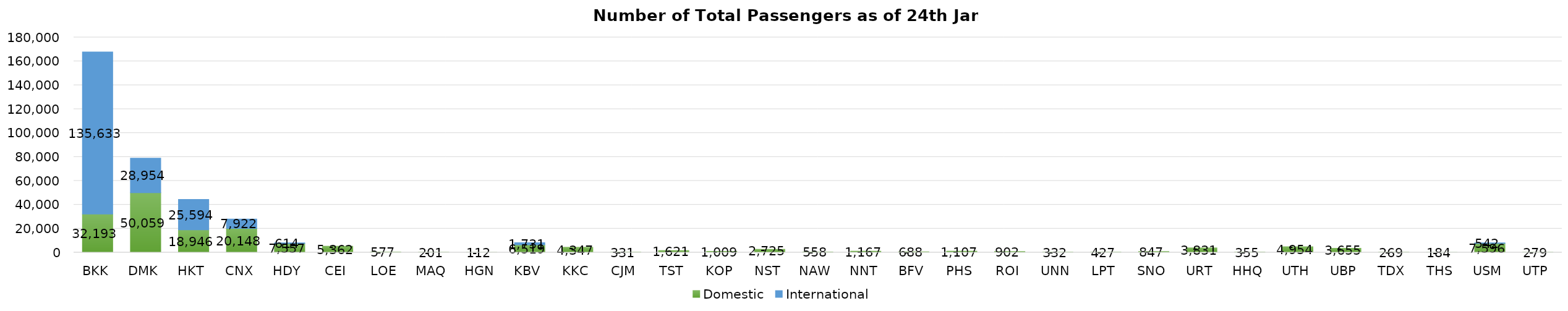
| Category | Domestic | International |
|---|---|---|
| BKK | 32193 | 135633 |
| DMK | 50059 | 28954 |
| HKT | 18946 | 25594 |
| CNX | 20148 | 7922 |
| HDY | 7557 | 614 |
| CEI | 5362 | 0 |
| LOE | 577 | 0 |
| MAQ | 201 | 0 |
| HGN | 112 | 0 |
| KBV | 6519 | 1731 |
| KKC | 4347 | 0 |
| CJM | 331 | 0 |
| TST | 1621 | 0 |
| KOP | 1009 | 0 |
| NST | 2725 | 0 |
| NAW | 558 | 0 |
| NNT | 1167 | 0 |
| BFV | 688 | 0 |
| PHS | 1107 | 0 |
| ROI | 902 | 0 |
| UNN | 332 | 0 |
| LPT | 427 | 0 |
| SNO | 847 | 0 |
| URT | 3831 | 0 |
| HHQ | 355 | 0 |
| UTH | 4954 | 0 |
| UBP | 3655 | 0 |
| TDX | 269 | 0 |
| THS | 184 | 0 |
| USM | 7596 | 542 |
| UTP | 279 | 0 |